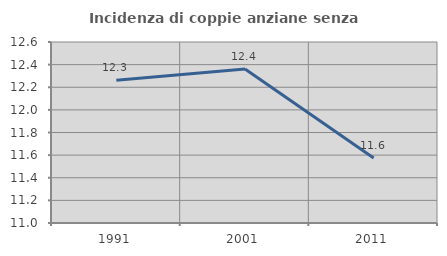
| Category | Incidenza di coppie anziane senza figli  |
|---|---|
| 1991.0 | 12.262 |
| 2001.0 | 12.362 |
| 2011.0 | 11.574 |